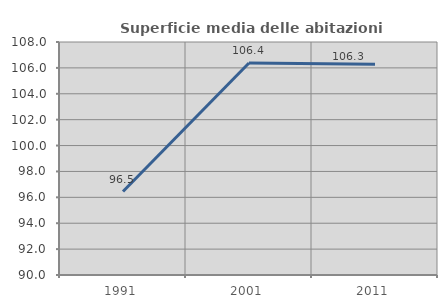
| Category | Superficie media delle abitazioni occupate |
|---|---|
| 1991.0 | 96.451 |
| 2001.0 | 106.379 |
| 2011.0 | 106.272 |